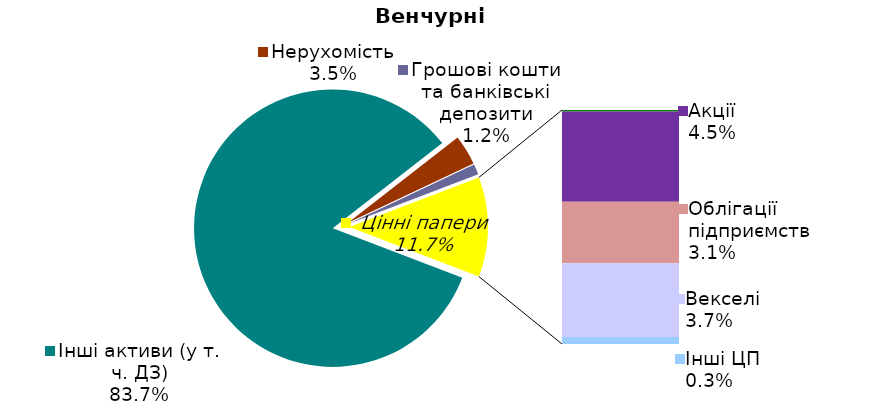
| Category | Series 0 |
|---|---|
| Інші активи (у т. ч. ДЗ) | 0.837 |
| Нерухомість | 0.035 |
| Грошові кошти та банківські депозити | 0.012 |
| Банківські метали | 0 |
| Облігації державні  | 0.001 |
| Акції | 0.045 |
| Облігації підприємств | 0.031 |
| Векселі | 0.037 |
| Заставні | 0 |
| Інші ЦП | 0.003 |